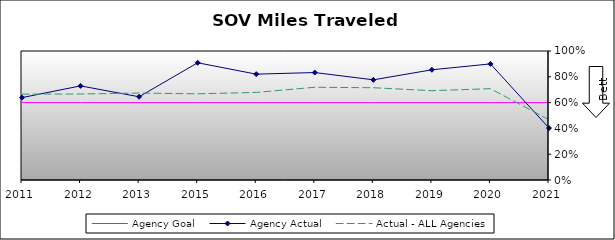
| Category | Agency Goal | Agency Actual | Actual - ALL Agencies |
|---|---|---|---|
| 2011.0 | 0.6 | 0.639 | 0.666 |
| 2012.0 | 0.6 | 0.73 | 0.666 |
| 2013.0 | 0.6 | 0.645 | 0.674 |
| 2015.0 | 0.6 | 0.909 | 0.668 |
| 2016.0 | 0.6 | 0.82 | 0.679 |
| 2017.0 | 0.6 | 0.833 | 0.719 |
| 2018.0 | 0.6 | 0.776 | 0.715 |
| 2019.0 | 0.6 | 0.854 | 0.692 |
| 2020.0 | 0.6 | 0.9 | 0.708 |
| 2021.0 | 0.6 | 0.403 | 0.467 |